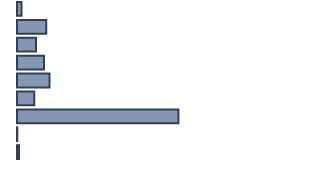
| Category | Percentatge |
|---|---|
| 0 | 1.5 |
| 1 | 10 |
| 2 | 6.5 |
| 3 | 9.2 |
| 4 | 11.1 |
| 5 | 5.9 |
| 6 | 55.1 |
| 7 | 0.1 |
| 8 | 0.7 |